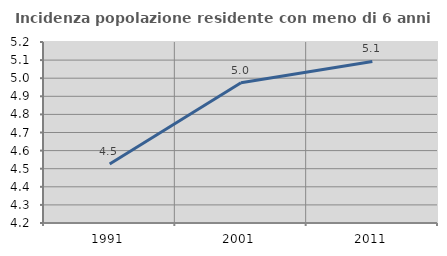
| Category | Incidenza popolazione residente con meno di 6 anni |
|---|---|
| 1991.0 | 4.526 |
| 2001.0 | 4.974 |
| 2011.0 | 5.092 |